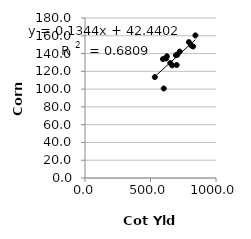
| Category | Series 0 |
|---|---|
| 601.0 | 100.7 |
| 705.0 | 138.6 |
| 533.0 | 113.5 |
| 700.0 | 127.1 |
| 666.0 | 126.7 |
| 619.0 | 134.4 |
| 595.0 | 133.8 |
| 625.0 | 136.9 |
| 694.0 | 138.2 |
| 651.0 | 129.3 |
| 723.0 | 142.2 |
| 843.0 | 160.4 |
| 825.0 | 148 |
| 811.0 | 149.1 |
| 793.0 | 152.9 |